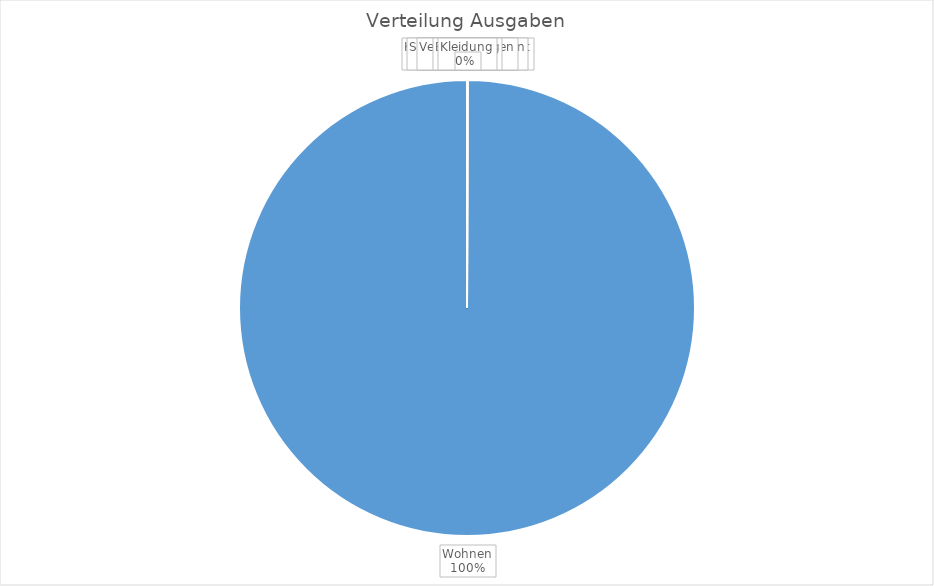
| Category | Summe |
|---|---|
| Wohnen | 800 |
| Körper & Gesundheit | 0 |
| Kommunikation | 0 |
| Mobilität | 0 |
| Urlaub | 0 |
| Steuern, Gebühren | 0 |
| Bildung | 0 |
| Freizeit | 0 |
| Krankenkasse | 0 |
| Versicherungen | 0 |
| Ernährung | 0 |
| Kleidung | 0 |